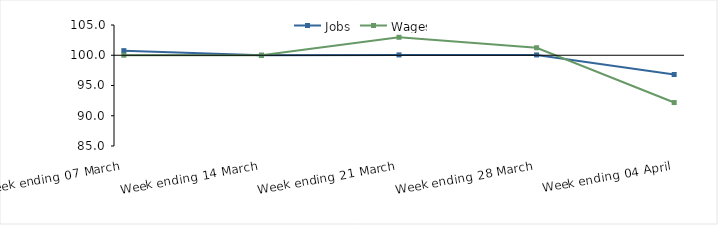
| Category | Jobs | Wages |
|---|---|---|
| 0 | 100.76 | 100.012 |
| 1900-01-01 | 100 | 100 |
| 1900-01-02 | 100.058 | 102.971 |
| 1900-01-03 | 100.051 | 101.239 |
| 1900-01-04 | 96.82 | 92.183 |